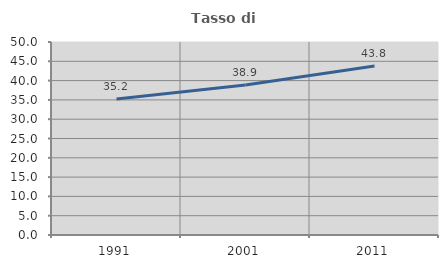
| Category | Tasso di occupazione   |
|---|---|
| 1991.0 | 35.233 |
| 2001.0 | 38.86 |
| 2011.0 | 43.776 |